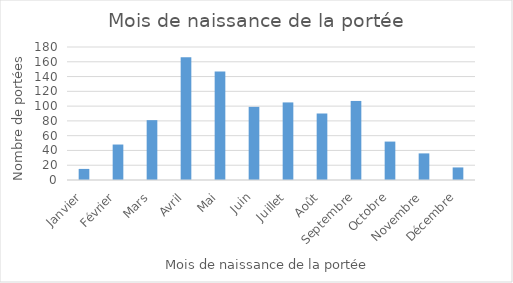
| Category | Series 0 |
|---|---|
| Janvier | 15 |
| Février | 48 |
| Mars | 81 |
| Avril | 166 |
| Mai | 147 |
| Juin | 99 |
| Juillet | 105 |
| Août | 90 |
| Septembre | 107 |
| Octobre | 52 |
| Novembre | 36 |
| Décembre | 17 |